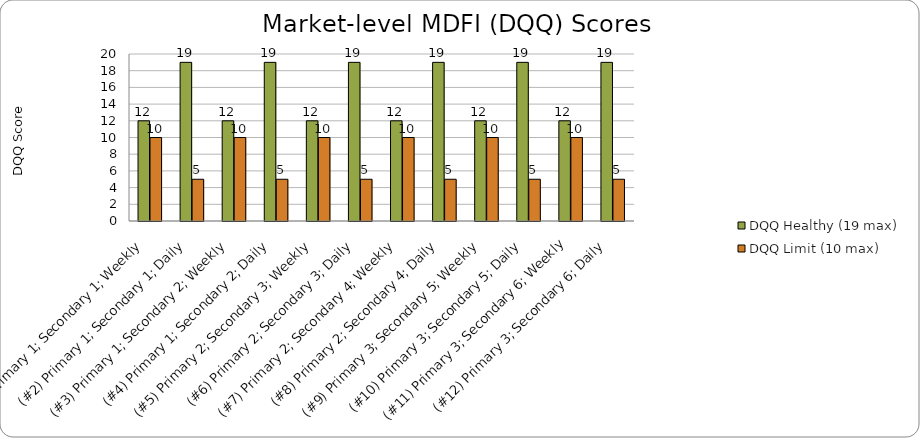
| Category | DQQ Healthy (19 max) | DQQ Limit (10 max) |
|---|---|---|
| (#1) Primary 1; Secondary 1; Weekly | 12 | 10 |
| (#2) Primary 1; Secondary 1; Daily | 19 | 5 |
| (#3) Primary 1; Secondary 2; Weekly | 12 | 10 |
| (#4) Primary 1; Secondary 2; Daily | 19 | 5 |
| (#5) Primary 2; Secondary 3; Weekly | 12 | 10 |
| (#6) Primary 2; Secondary 3; Daily | 19 | 5 |
| (#7) Primary 2; Secondary 4; Weekly | 12 | 10 |
| (#8) Primary 2; Secondary 4; Daily | 19 | 5 |
| (#9) Primary 3; Secondary 5; Weekly | 12 | 10 |
| (#10) Primary 3; Secondary 5; Daily | 19 | 5 |
| (#11) Primary 3; Secondary 6; Weekly | 12 | 10 |
| (#12) Primary 3; Secondary 6; Daily | 19 | 5 |